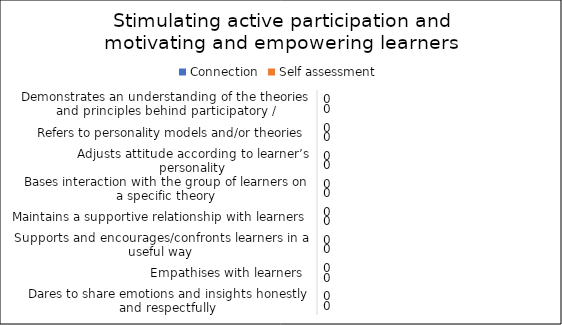
| Category | Connection | Self assessment |
|---|---|---|
| Demonstrates an understanding of the theories and principles behind participatory / emancipatory / empowerment pedagogy | 0 | 0 |
| Refers to personality models and/or theories | 0 | 0 |
| Adjusts attitude according to learner’s personality | 0 | 0 |
| Bases interaction with the group of learners on a specific theory | 0 | 0 |
| Maintains a supportive relationship with learners | 0 | 0 |
| Supports and encourages/confronts learners in a useful way | 0 | 0 |
| Empathises with learners  | 0 | 0 |
| Dares to share emotions and insights honestly and respectfully | 0 | 0 |